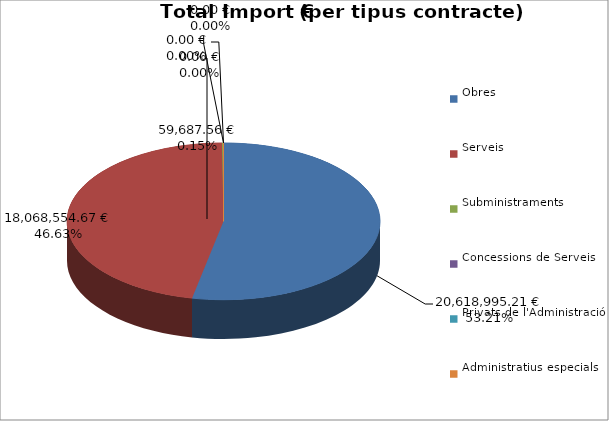
| Category | Total preu
(amb IVA) |
|---|---|
| Obres | 20618995.213 |
| Serveis | 18068554.666 |
| Subministraments | 59687.56 |
| Concessions de Serveis | 0 |
| Privats de l'Administració | 0 |
| Administratius especials | 0 |